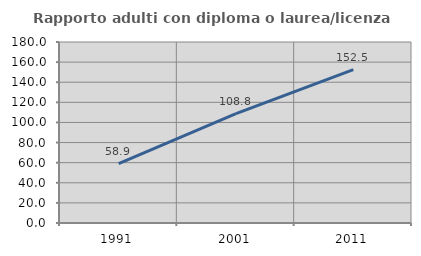
| Category | Rapporto adulti con diploma o laurea/licenza media  |
|---|---|
| 1991.0 | 58.945 |
| 2001.0 | 108.842 |
| 2011.0 | 152.489 |